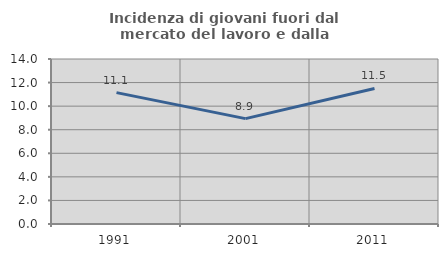
| Category | Incidenza di giovani fuori dal mercato del lavoro e dalla formazione  |
|---|---|
| 1991.0 | 11.149 |
| 2001.0 | 8.943 |
| 2011.0 | 11.5 |